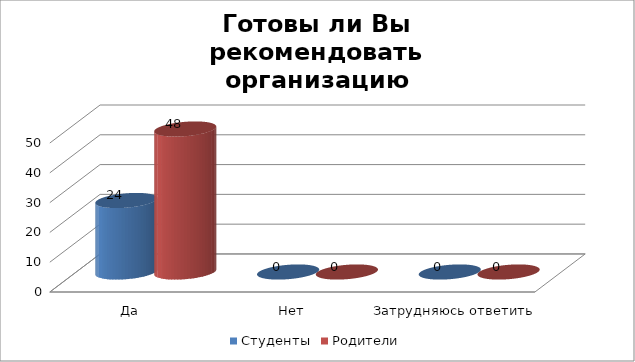
| Category | Студенты | Родители |
|---|---|---|
| Да | 24 | 48 |
| Нет | 0 | 0 |
| Затрудняюсь ответить | 0 | 0 |